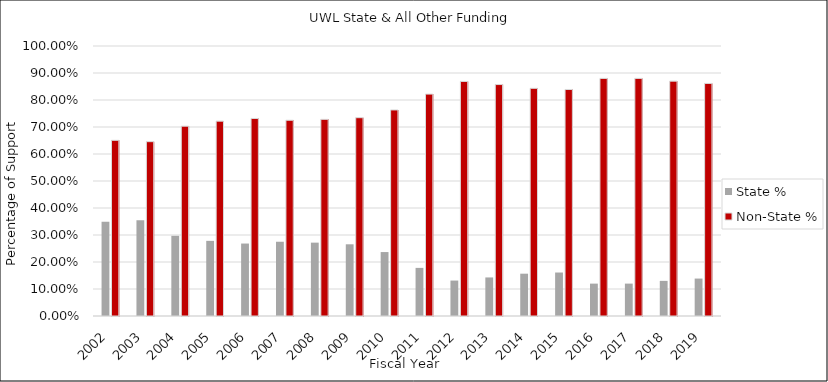
| Category | State % | Non-State % |
|---|---|---|
| 2002.0 | 0.349 | 0.651 |
| 2003.0 | 0.354 | 0.646 |
| 2004.0 | 0.297 | 0.703 |
| 2005.0 | 0.278 | 0.722 |
| 2006.0 | 0.268 | 0.732 |
| 2007.0 | 0.275 | 0.725 |
| 2008.0 | 0.272 | 0.728 |
| 2009.0 | 0.266 | 0.734 |
| 2010.0 | 0.237 | 0.763 |
| 2011.0 | 0.178 | 0.822 |
| 2012.0 | 0.131 | 0.869 |
| 2013.0 | 0.143 | 0.857 |
| 2014.0 | 0.157 | 0.843 |
| 2015.0 | 0.161 | 0.839 |
| 2016.0 | 0.12 | 0.88 |
| 2017.0 | 0.12 | 0.88 |
| 2018.0 | 0.13 | 0.87 |
| 2019.0 | 0.139 | 0.861 |